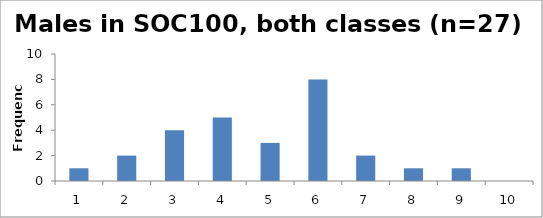
| Category | Frequency |
|---|---|
| 1.0 | 1 |
| 2.0 | 2 |
| 3.0 | 4 |
| 4.0 | 5 |
| 5.0 | 3 |
| 6.0 | 8 |
| 7.0 | 2 |
| 8.0 | 1 |
| 9.0 | 1 |
| 10.0 | 0 |